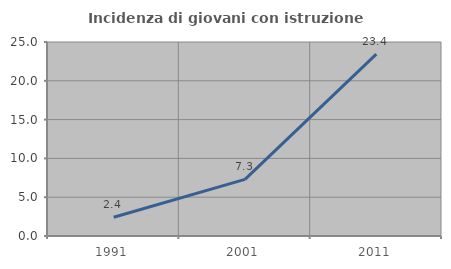
| Category | Incidenza di giovani con istruzione universitaria |
|---|---|
| 1991.0 | 2.422 |
| 2001.0 | 7.295 |
| 2011.0 | 23.446 |